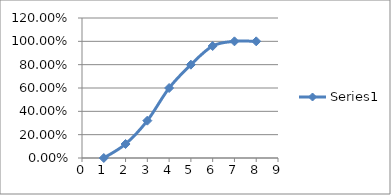
| Category | Series 0 |
|---|---|
| 0 | 0 |
| 1 | 0.12 |
| 2 | 0.32 |
| 3 | 0.6 |
| 4 | 0.8 |
| 5 | 0.96 |
| 6 | 1 |
| 7 | 1 |